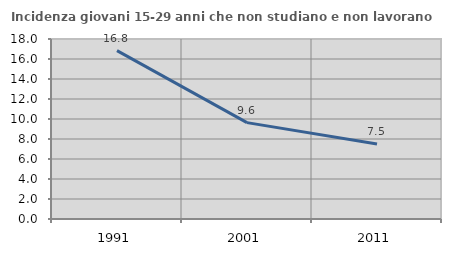
| Category | Incidenza giovani 15-29 anni che non studiano e non lavorano  |
|---|---|
| 1991.0 | 16.837 |
| 2001.0 | 9.639 |
| 2011.0 | 7.51 |